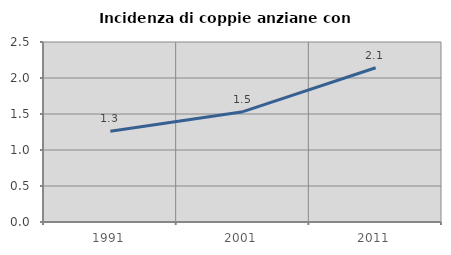
| Category | Incidenza di coppie anziane con figli |
|---|---|
| 1991.0 | 1.261 |
| 2001.0 | 1.533 |
| 2011.0 | 2.143 |